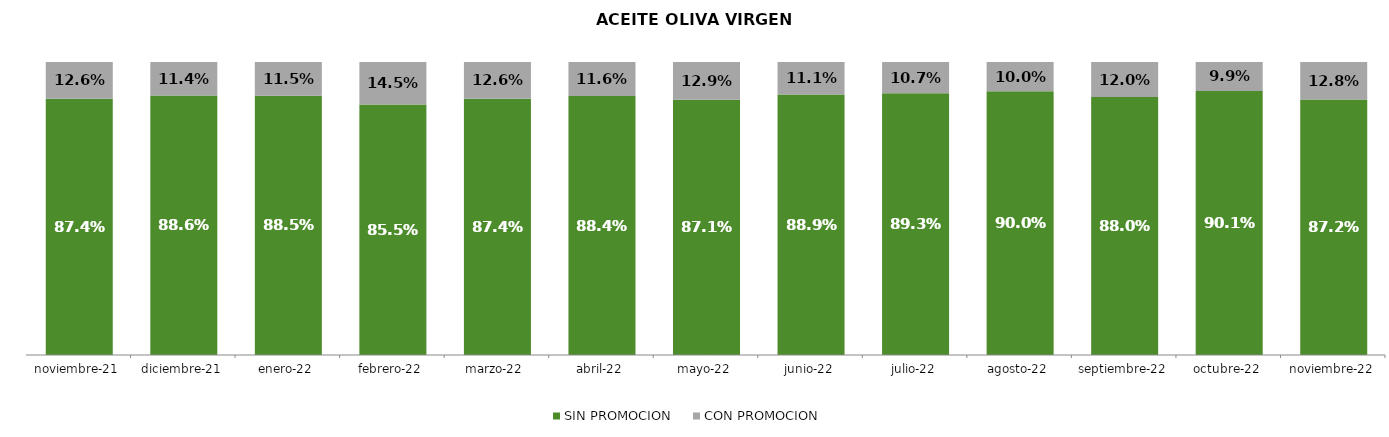
| Category | SIN PROMOCION   | CON PROMOCION   |
|---|---|---|
| 2021-11-01 | 0.874 | 0.126 |
| 2021-12-01 | 0.886 | 0.114 |
| 2022-01-01 | 0.885 | 0.115 |
| 2022-02-01 | 0.855 | 0.145 |
| 2022-03-01 | 0.874 | 0.126 |
| 2022-04-01 | 0.884 | 0.116 |
| 2022-05-01 | 0.871 | 0.129 |
| 2022-06-01 | 0.889 | 0.111 |
| 2022-07-01 | 0.893 | 0.107 |
| 2022-08-01 | 0.9 | 0.1 |
| 2022-09-01 | 0.88 | 0.12 |
| 2022-10-01 | 0.901 | 0.099 |
| 2022-11-01 | 0.872 | 0.128 |